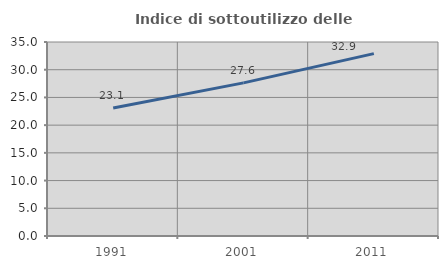
| Category | Indice di sottoutilizzo delle abitazioni  |
|---|---|
| 1991.0 | 23.077 |
| 2001.0 | 27.626 |
| 2011.0 | 32.906 |